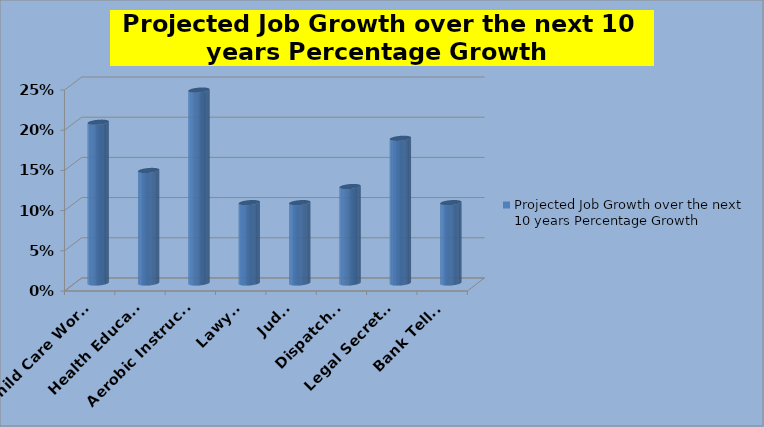
| Category | Projected Job Growth over the next 10 years Percentage Growth  |
|---|---|
| Child Care Worker | 0.2 |
| Health Educator | 0.14 |
| Aerobic Instructor | 0.24 |
| Lawyer | 0.1 |
| Judge | 0.1 |
| Dispatcher | 0.12 |
| Legal Secretary | 0.18 |
| Bank Teller | 0.1 |